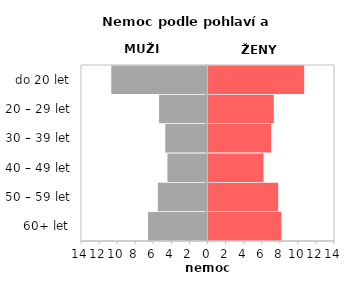
| Category | Nemoc |
|---|---|
| 60+ let | 8.05 |
| 50 – 59 let | 7.709 |
| 40 – 49 let | 6.082 |
| 30 – 39 let | 6.932 |
| 20 – 29 let | 7.226 |
| do 20 let | 10.59 |